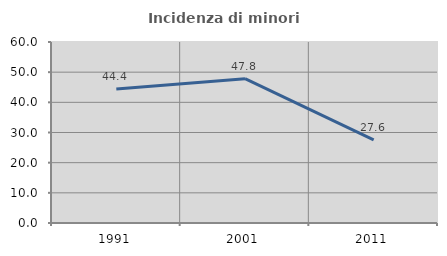
| Category | Incidenza di minori stranieri |
|---|---|
| 1991.0 | 44.444 |
| 2001.0 | 47.826 |
| 2011.0 | 27.586 |